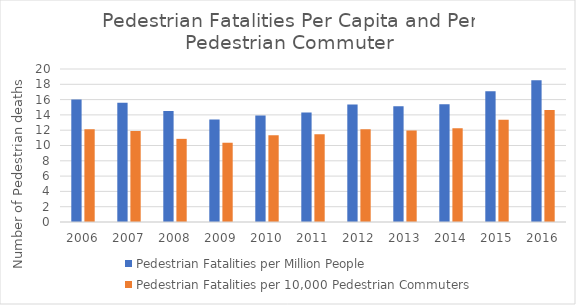
| Category | Pedestrian Fatalities per Million People | Pedestrian Fatalities per 10,000 Pedestrian Commuters |
|---|---|---|
| 2006.0 | 16.015 | 12.135 |
| 2007.0 | 15.579 | 11.884 |
| 2008.0 | 14.517 | 10.869 |
| 2009.0 | 13.384 | 10.361 |
| 2010.0 | 13.907 | 11.33 |
| 2011.0 | 14.304 | 11.464 |
| 2012.0 | 15.348 | 12.139 |
| 2013.0 | 15.117 | 11.946 |
| 2014.0 | 15.399 | 12.241 |
| 2015.0 | 17.096 | 13.356 |
| 2016.0 | 18.528 | 14.651 |